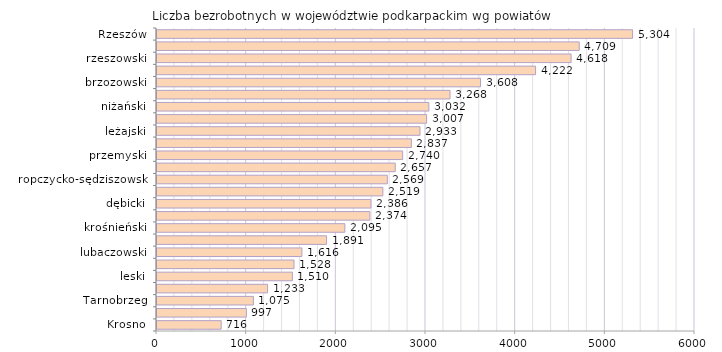
| Category | Liczba bezrobotnych w województwie podkarpackim wg powiatów |
|---|---|
| Krosno | 716 |
| bieszczadzki | 997 |
| Tarnobrzeg | 1075 |
| tarnobrzeski  | 1233 |
| leski | 1510 |
| kolbuszowski | 1528 |
| lubaczowski | 1616 |
| stalowowolski | 1891 |
| krośnieński | 2095 |
| Przemyśl | 2374 |
| dębicki | 2386 |
| łańcucki | 2519 |
| ropczycko-sędziszowski | 2569 |
| sanocki | 2657 |
| przemyski | 2740 |
| mielecki | 2837 |
| leżajski | 2933 |
| strzyżowski | 3007 |
| niżański | 3032 |
| przeworski | 3268 |
| brzozowski | 3608 |
| jarosławski | 4222 |
| rzeszowski | 4618 |
| jasielski | 4709 |
| Rzeszów | 5304 |